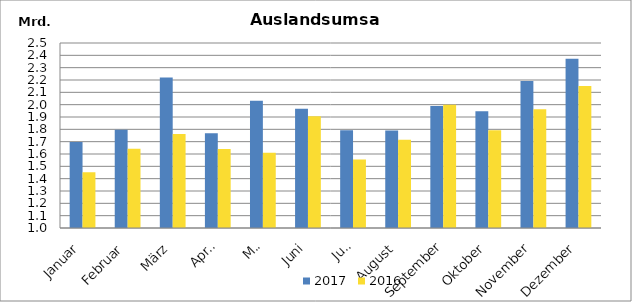
| Category | 2017 | 2016 |
|---|---|---|
| Januar | 1697393.234 | 1452081.693 |
| Februar | 1796494.509 | 1643560.447 |
| März | 2219723.786 | 1761612.74 |
| April | 1768469.024 | 1639915.003 |
| Mai | 2031896.731 | 1610839.505 |
| Juni | 1966792.794 | 1906014.647 |
| Juli | 1793385.858 | 1555689.376 |
| August | 1791245.495 | 1715637.079 |
| September | 1989013.637 | 1999998.291 |
| Oktober | 1945904.405 | 1793471.904 |
| November | 2192322.744 | 1962954.881 |
| Dezember | 2372680.615 | 2151354.306 |